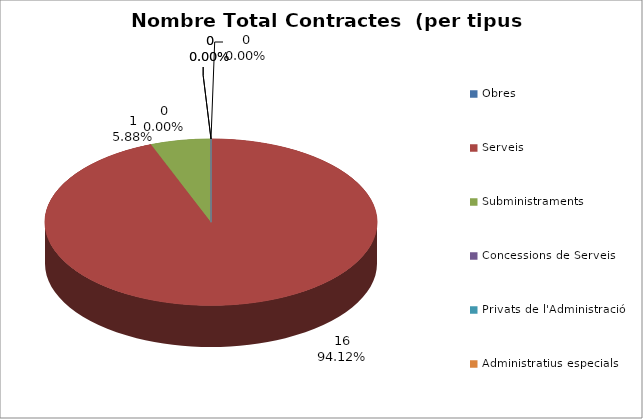
| Category | Nombre Total Contractes |
|---|---|
| Obres | 0 |
| Serveis | 16 |
| Subministraments | 1 |
| Concessions de Serveis | 0 |
| Privats de l'Administració | 0 |
| Administratius especials | 0 |